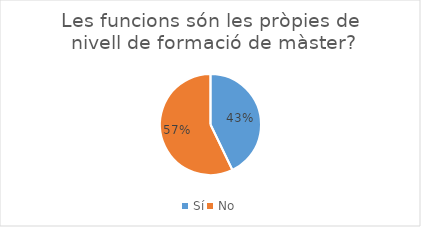
| Category | Series 0 |
|---|---|
| Sí | 3 |
| No | 4 |